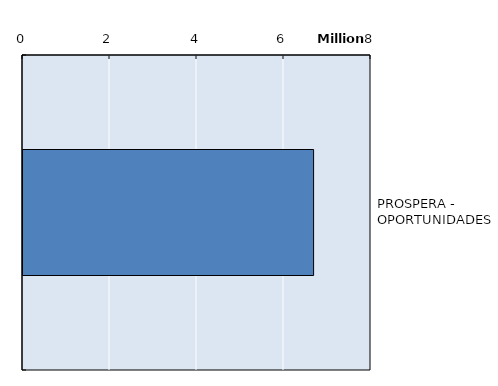
| Category | Series 0 |
|---|---|
| PROSPERA - OPORTUNIDADES | 6680368 |